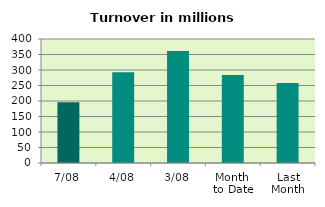
| Category | Series 0 |
|---|---|
| 7/08 | 195.656 |
| 4/08 | 292.442 |
| 3/08 | 361.592 |
| Month 
to Date | 283.482 |
| Last
Month | 258.125 |